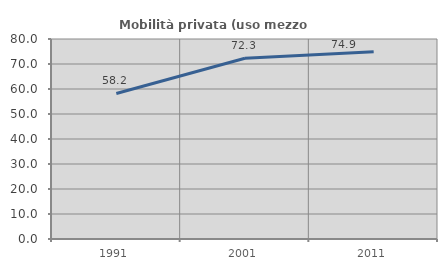
| Category | Mobilità privata (uso mezzo privato) |
|---|---|
| 1991.0 | 58.224 |
| 2001.0 | 72.305 |
| 2011.0 | 74.918 |